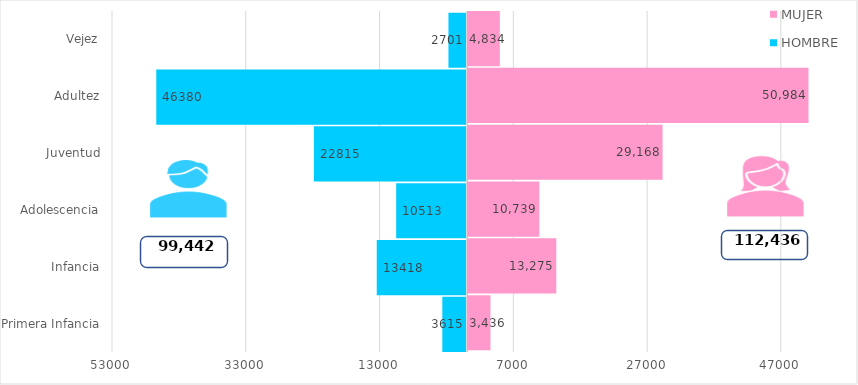
| Category | HOMBRE | MUJER |
|---|---|---|
| Primera Infancia | -3615 | 3436 |
| Infancia | -13418 | 13275 |
| Adolescencia | -10513 | 10739 |
| Juventud | -22815 | 29168 |
| Adultez | -46380 | 50984 |
| Vejez | -2701 | 4834 |